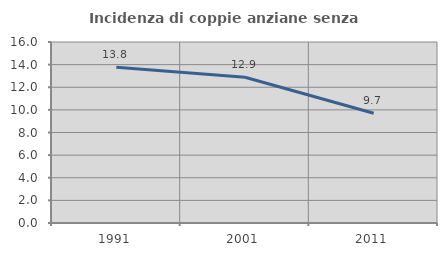
| Category | Incidenza di coppie anziane senza figli  |
|---|---|
| 1991.0 | 13.763 |
| 2001.0 | 12.885 |
| 2011.0 | 9.698 |